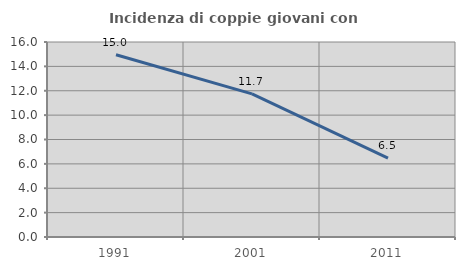
| Category | Incidenza di coppie giovani con figli |
|---|---|
| 1991.0 | 14.952 |
| 2001.0 | 11.746 |
| 2011.0 | 6.47 |